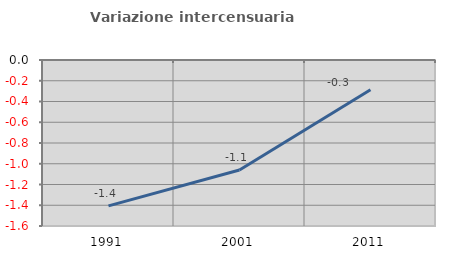
| Category | Variazione intercensuaria annua |
|---|---|
| 1991.0 | -1.407 |
| 2001.0 | -1.061 |
| 2011.0 | -0.288 |